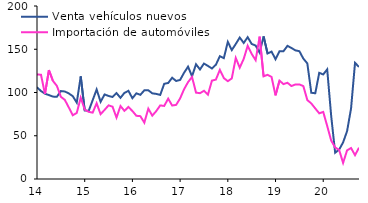
| Category | Venta vehículos nuevos | Importación de automóviles |
|---|---|---|
| 2014-01-01 | 106.058 | 120.727 |
| 2014-02-01 | 101.664 | 120.621 |
| 2014-03-01 | 98.619 | 98.384 |
| 2014-04-01 | 97.021 | 125.875 |
| 2014-05-01 | 95.259 | 113.488 |
| 2014-06-01 | 95.059 | 107.63 |
| 2014-07-01 | 101.655 | 95.085 |
| 2014-08-01 | 101.176 | 91.459 |
| 2014-09-01 | 98.914 | 82.692 |
| 2014-10-01 | 95.772 | 73.689 |
| 2014-11-01 | 88.314 | 76.397 |
| 2014-12-01 | 118.662 | 93.953 |
| 2015-01-01 | 79.255 | 80.266 |
| 2015-02-01 | 78.694 | 77.644 |
| 2015-03-01 | 91.073 | 76.699 |
| 2015-04-01 | 103.498 | 87.57 |
| 2015-05-01 | 89.258 | 74.938 |
| 2015-06-01 | 97.739 | 79.897 |
| 2015-07-01 | 96.015 | 85.106 |
| 2015-08-01 | 94.818 | 83.602 |
| 2015-09-01 | 99.291 | 70.994 |
| 2015-10-01 | 93.851 | 84.348 |
| 2015-11-01 | 99.584 | 78.768 |
| 2015-12-01 | 101.919 | 83.288 |
| 2016-01-01 | 93.375 | 78.568 |
| 2016-02-01 | 99.049 | 73.095 |
| 2016-03-01 | 97.304 | 72.622 |
| 2016-04-01 | 102.518 | 65.146 |
| 2016-05-01 | 102.582 | 81.308 |
| 2016-06-01 | 99.044 | 73.246 |
| 2016-07-01 | 98.383 | 78.516 |
| 2016-08-01 | 97.251 | 85.064 |
| 2016-09-01 | 110.046 | 84.488 |
| 2016-10-01 | 111.018 | 92.893 |
| 2016-11-01 | 117.072 | 84.93 |
| 2016-12-01 | 113.315 | 85.678 |
| 2017-01-01 | 114.546 | 93.178 |
| 2017-02-01 | 122.867 | 103.819 |
| 2017-03-01 | 129.895 | 111.997 |
| 2017-04-01 | 118.686 | 117.972 |
| 2017-05-01 | 132.641 | 99.83 |
| 2017-06-01 | 126.621 | 99.205 |
| 2017-07-01 | 133.464 | 101.969 |
| 2017-08-01 | 130.73 | 97.481 |
| 2017-09-01 | 127.781 | 113.714 |
| 2017-10-01 | 132.092 | 114.932 |
| 2017-11-01 | 141.97 | 126.189 |
| 2017-12-01 | 139.736 | 116.673 |
| 2018-01-01 | 158.571 | 113.069 |
| 2018-02-01 | 149.015 | 116.28 |
| 2018-03-01 | 156.093 | 139.944 |
| 2018-04-01 | 163.533 | 128.718 |
| 2018-05-01 | 157.279 | 138.861 |
| 2018-06-01 | 163.953 | 154.034 |
| 2018-07-01 | 156.154 | 144.629 |
| 2018-08-01 | 154.23 | 137.388 |
| 2018-09-01 | 146.067 | 164.544 |
| 2018-10-01 | 164.891 | 118.722 |
| 2018-11-01 | 145.059 | 120.379 |
| 2018-12-01 | 147.305 | 118.005 |
| 2019-01-01 | 138.457 | 96.681 |
| 2019-02-01 | 147.574 | 113.712 |
| 2019-03-01 | 147.748 | 109.698 |
| 2019-04-01 | 153.912 | 111.263 |
| 2019-05-01 | 151.498 | 107.476 |
| 2019-06-01 | 148.696 | 109.299 |
| 2019-07-01 | 147.737 | 109.374 |
| 2019-08-01 | 139.16 | 107.359 |
| 2019-09-01 | 133.664 | 91.27 |
| 2019-10-01 | 99.717 | 87.348 |
| 2019-11-01 | 99.109 | 81.545 |
| 2019-12-01 | 122.74 | 75.932 |
| 2020-01-01 | 120.862 | 77.543 |
| 2020-02-01 | 126.76 | 61.352 |
| 2020-03-01 | 72.999 | 44.485 |
| 2020-04-01 | 30.389 | 36.456 |
| 2020-05-01 | 33.973 | 33.641 |
| 2020-06-01 | 42.291 | 18.618 |
| 2020-07-01 | 55.349 | 33.115 |
| 2020-08-01 | 81.427 | 35.823 |
| 2020-09-01 | 134.281 | 27.576 |
| 2020-10-01 | 129.481 | 36.175 |